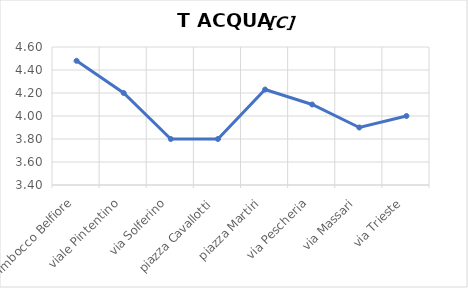
| Category | T ACQUA [C] |
|---|---|
| Imbocco Belfiore | 4.48 |
| viale Pintentino | 4.2 |
| via Solferino | 3.8 |
| piazza Cavallotti | 3.8 |
| piazza Martiri | 4.23 |
| via Pescheria | 4.1 |
| via Massari | 3.9 |
| via Trieste | 4 |